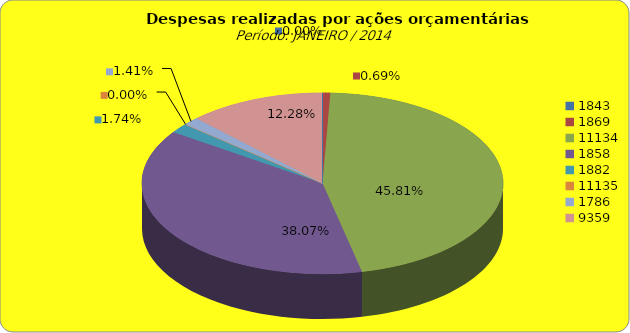
| Category | Series 1 |
|---|---|
| 1843.0 | 0 |
| 1869.0 | 183259.37 |
| 11134.0 | 12161028.49 |
| 1858.0 | 10107460.6 |
| 1882.0 | 460659.2 |
| 11135.0 | 0 |
| 1786.0 | 375060.15 |
| 9359.0 | 3260480.47 |